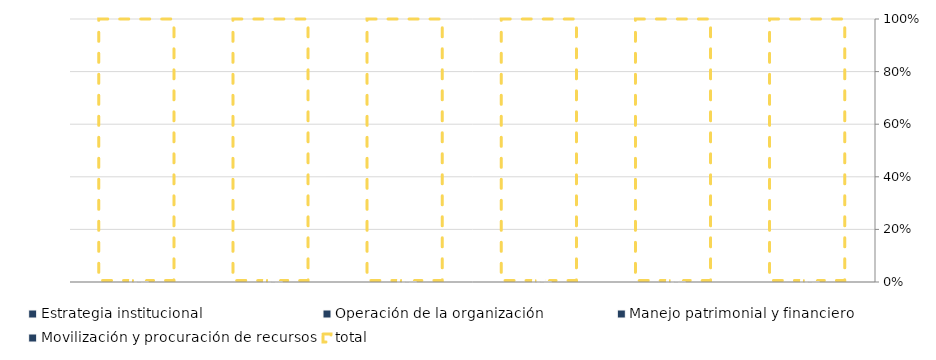
| Category | Estrategia institucional | Operación de la organización | Manejo patrimonial y financiero | Movilización y procuración de recursos |
|---|---|---|---|---|
|  | 0 | 0 | 0 | 0 |
|  | 0 | 0 | 0 | 0 |
|  | 0 | 0 | 0 | 0 |
|  | 0 | 0 | 0 | 0 |
|  | 0 | 0 | 0 | 0 |
|  | 0 | 0 | 0 | 0 |